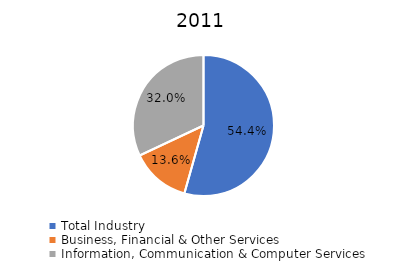
| Category | Series 0 |
|---|---|
| Total Industry | 0.544 |
| Business, Financial & Other Services | 0.136 |
| Information, Communication & Computer Services | 0.32 |